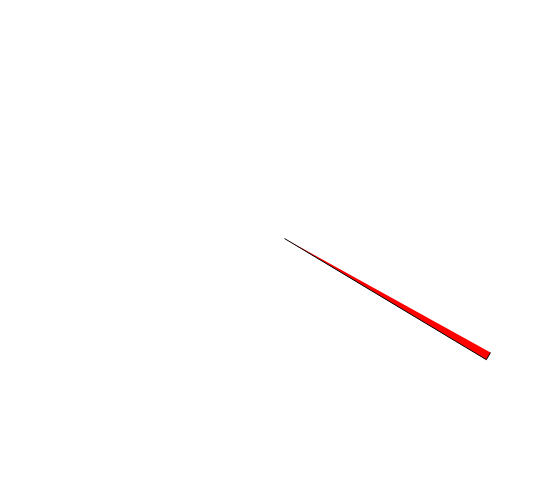
| Category | Series 1 |
|---|---|
| 0 | 256.98 |
| 1 | 2 |
| 2 | 101.02 |